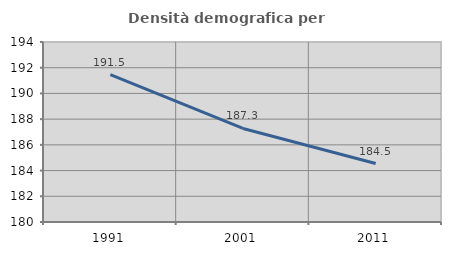
| Category | Densità demografica |
|---|---|
| 1991.0 | 191.457 |
| 2001.0 | 187.278 |
| 2011.0 | 184.549 |